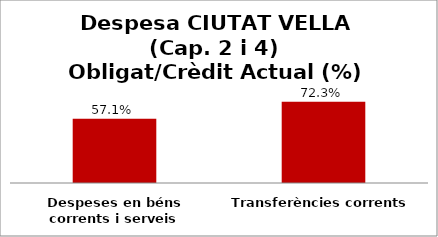
| Category | Series 0 |
|---|---|
| Despeses en béns corrents i serveis | 0.571 |
| Transferències corrents | 0.723 |